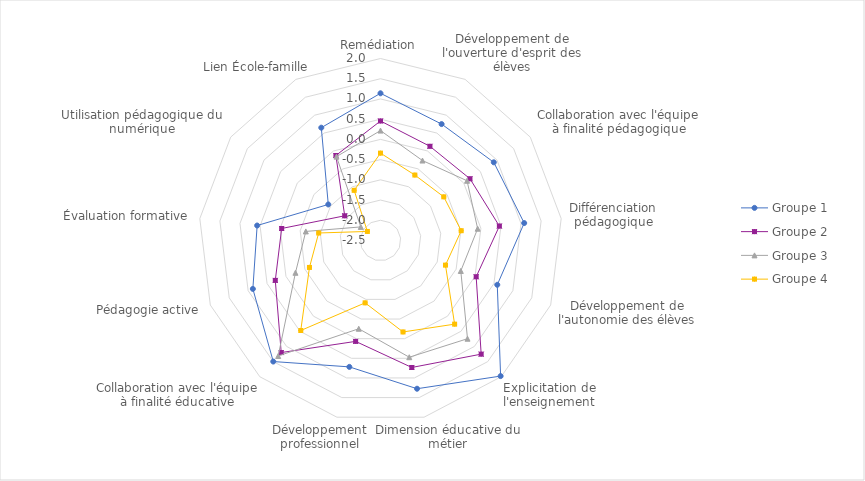
| Category | Groupe 1 | Groupe 2 | Groupe 3 | Groupe 4 |
|---|---|---|---|---|
| Remédiation | 1.14 | 0.455 | 0.218 | -0.34 |
| Développement de l'ouverture d'esprit des élèves | 0.751 | 0.13 | -0.267 | -0.672 |
| Collaboration avec l'équipe à finalité pédagogique | 0.903 | 0.188 | 0.1 | -0.599 |
| Différenciation pédagogique | 1.079 | 0.461 | -0.08 | -0.49 |
| Développement de l'autonomie des élèves | 0.588 | 0.03 | -0.377 | -0.782 |
| Explicitation de l'enseignement | 1.979 | 1.254 | 0.744 | 0.263 |
| Dimension éducative du métier | 1.275 | 0.734 | 0.472 | -0.171 |
| Développement professionnel | 0.719 | 0.069 | -0.253 | -0.912 |
| Collaboration avec l'équipe à finalité éducative | 1.498 | 1.202 | 1.315 | 0.473 |
| Pédagogie active | 0.875 | 0.282 | -0.251 | -0.621 |
| Évaluation formative | 0.572 | -0.038 | -0.64 | -0.96 |
| Utilisation pédagogique du numérique | -0.931 | -1.425 | -1.909 | -2.106 |
| Lien École-famille | 0.65 | -0.126 | -0.158 | -1.099 |